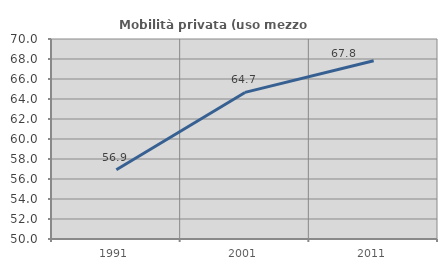
| Category | Mobilità privata (uso mezzo privato) |
|---|---|
| 1991.0 | 56.917 |
| 2001.0 | 64.658 |
| 2011.0 | 67.828 |